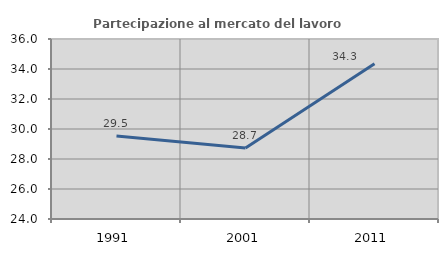
| Category | Partecipazione al mercato del lavoro  femminile |
|---|---|
| 1991.0 | 29.526 |
| 2001.0 | 28.726 |
| 2011.0 | 34.345 |